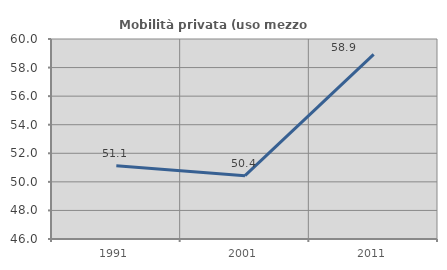
| Category | Mobilità privata (uso mezzo privato) |
|---|---|
| 1991.0 | 51.128 |
| 2001.0 | 50.435 |
| 2011.0 | 58.929 |